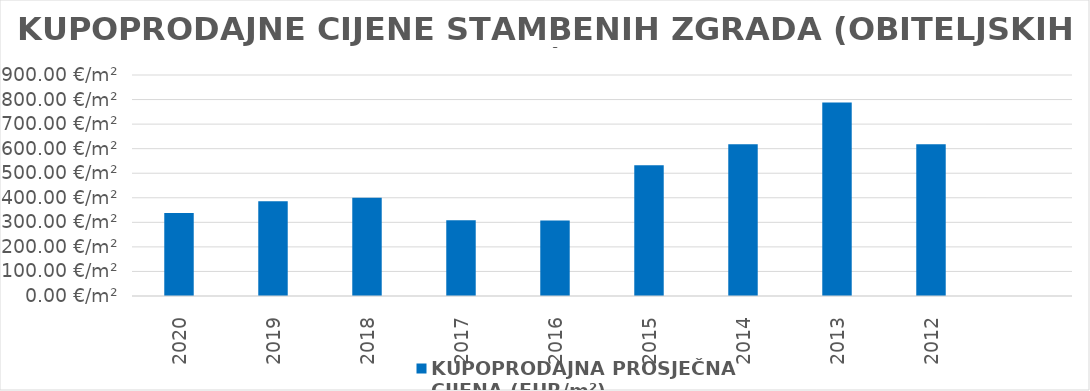
| Category | KUPOPRODAJNA PROSJEČNA 
CIJENA (EUR/m²) |
|---|---|
| 2020 | 1900-12-03 03:02:13 |
| 2019 | 1901-01-19 21:42:29 |
| 2018 | 1901-02-02 18:07:40 |
| 2017 | 1900-11-03 19:00:38 |
| 2016 | 1900-11-02 05:04:49 |
| 2015 | 1901-06-15 13:53:49 |
| 2014 | 1901-09-09 10:01:23 |
| 2013 | 1902-02-26 06:58:28 |
| 2012 | 1901-09-09 05:14:34 |